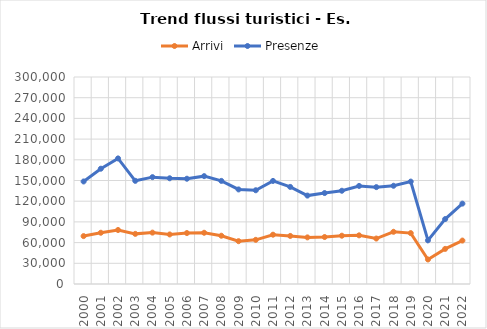
| Category | Arrivi | Presenze |
|---|---|---|
| 2000.0 | 69428 | 148605 |
| 2001.0 | 74292 | 167086 |
| 2002.0 | 78257 | 182002 |
| 2003.0 | 72662 | 149522 |
| 2004.0 | 74464 | 154874 |
| 2005.0 | 71801 | 153220 |
| 2006.0 | 73847 | 152561 |
| 2007.0 | 74264 | 156311 |
| 2008.0 | 69962 | 149417 |
| 2009.0 | 62051 | 137049 |
| 2010.0 | 64002 | 135867 |
| 2011.0 | 71455 | 149398 |
| 2012.0 | 69660 | 140712 |
| 2013.0 | 67562 | 128132 |
| 2014.0 | 68088 | 131825 |
| 2015.0 | 70000 | 135139 |
| 2016.0 | 70516 | 142127 |
| 2017.0 | 65876 | 140401 |
| 2018.0 | 75662 | 142369 |
| 2019.0 | 73776 | 148422 |
| 2020.0 | 35556 | 63298 |
| 2021.0 | 50905 | 94110 |
| 2022.0 | 62936 | 116498 |